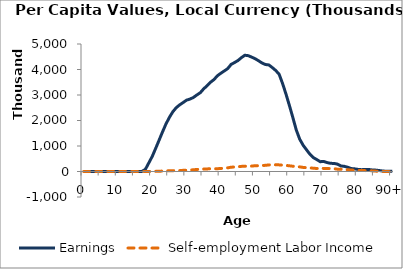
| Category | Earnings | Self-employment Labor Income |
|---|---|---|
| 0 | 0 | 0 |
|  | 0 | 0 |
| 2 | 0 | 0 |
| 3 | 0 | 0 |
| 4 | 0 | 0 |
| 5 | 0 | 0 |
| 6 | 0 | 0 |
| 7 | 0 | 0 |
| 8 | 0 | 0 |
| 9 | 0 | 0 |
| 10 | 0 | 0 |
| 11 | 0 | 0 |
| 12 | 0 | 0 |
| 13 | 0 | 0 |
| 14 | 0 | 0 |
| 15 | 0 | 0 |
| 16 | 726.296 | 0 |
| 17 | 4564.09 | 0 |
| 18 | 86788.33 | 1820.825 |
| 19 | 340832.114 | 944.127 |
| 20 | 596105.715 | 3149.558 |
| 21 | 910948.093 | 5534.505 |
| 22 | 1233081.559 | 8851.764 |
| 23 | 1557600.66 | 18459.497 |
| 24 | 1867372.946 | 22365.555 |
| 25 | 2124202.325 | 28085.209 |
| 26 | 2344917.288 | 32386.819 |
| 27 | 2504691.1 | 35483.59 |
| 28 | 2615138.228 | 35015.791 |
| 29 | 2705304.9 | 46273.889 |
| 30 | 2798859.441 | 50045.196 |
| 31 | 2840001.906 | 57129.492 |
| 32 | 2904175.588 | 66767.938 |
| 33 | 3001683.626 | 81362.542 |
| 34 | 3089866.196 | 87079.85 |
| 35 | 3243328.529 | 97602.516 |
| 36 | 3365294.368 | 101096.974 |
| 37 | 3502279.775 | 109181.777 |
| 38 | 3605765.28 | 104745.715 |
| 39 | 3755905.978 | 110318.868 |
| 40 | 3853754.891 | 117431.891 |
| 41 | 3942591.67 | 134150.627 |
| 42 | 4035797.24 | 144013.609 |
| 43 | 4200730.648 | 168587.532 |
| 44 | 4272636.257 | 176632.186 |
| 45 | 4352639.55 | 186542.138 |
| 46 | 4466381.202 | 200864.8 |
| 47 | 4559193.707 | 206963.843 |
| 48 | 4542099.261 | 209032.033 |
| 49 | 4484497.185 | 212512.851 |
| 50 | 4422819.042 | 227203.42 |
| 51 | 4343506.854 | 225811.621 |
| 52 | 4254943.21 | 237091.793 |
| 53 | 4195797.252 | 241004.851 |
| 54 | 4178754.158 | 259559.004 |
| 55 | 4075921.795 | 260879.685 |
| 56 | 3961304.671 | 263819.864 |
| 57 | 3813107.787 | 259628.043 |
| 58 | 3450344.698 | 248428.599 |
| 59 | 3034535.22 | 238579.114 |
| 60 | 2584711.335 | 223240.054 |
| 61 | 2115288.682 | 206524.14 |
| 62 | 1627211.261 | 191400.483 |
| 63 | 1266820.798 | 181081.765 |
| 64 | 1029716.012 | 159972.289 |
| 65 | 847474.329 | 147926.208 |
| 66 | 674010.091 | 142225.652 |
| 67 | 544482.483 | 128832.954 |
| 68 | 464641.991 | 117944.726 |
| 69 | 384653.272 | 128290.132 |
| 70 | 394965.851 | 119703.682 |
| 71 | 349576.912 | 119144.744 |
| 72 | 319741.085 | 115119.56 |
| 73 | 316646.052 | 111525.346 |
| 74 | 289703.053 | 91076.144 |
| 75 | 217849.958 | 89067.998 |
| 76 | 202785.68 | 77816.022 |
| 77 | 167247.258 | 68960.219 |
| 78 | 115658.445 | 59045.322 |
| 79 | 104900.834 | 47412.929 |
| 80 | 82248.529 | 40542.218 |
| 81 | 71729.043 | 34204.958 |
| 82 | 78677.101 | 34327.111 |
| 83 | 82138.937 | 30327.462 |
| 84 | 63326.858 | 25457.567 |
| 85 | 56536.612 | 15893.52 |
| 86 | 41530.617 | 8573.867 |
| 87 | 22179.651 | 2182.536 |
| 88 | 11558.917 | 0 |
| 89 | 12009.001 | 0 |
| 90+ | 12459.085 | 0 |